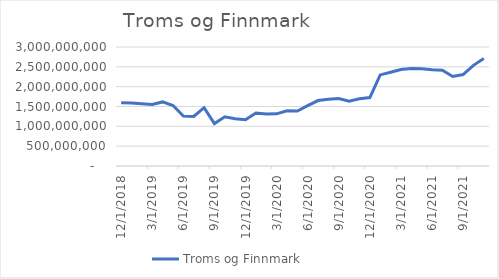
| Category | Troms og Finnmark |
|---|---|
| 12/1/18 | 1596119583.333 |
| 1/1/19 | 1590336666.667 |
| 2/1/19 | 1571578333.333 |
| 3/1/19 | 1551990833.333 |
| 4/1/19 | 1615329166.667 |
| 5/1/19 | 1523640833.333 |
| 6/1/19 | 1260486666.667 |
| 7/1/19 | 1248049166.667 |
| 8/1/19 | 1469640833.333 |
| 9/1/19 | 1069361666.667 |
| 10/1/19 | 1242163333.333 |
| 11/1/19 | 1193659166.667 |
| 12/1/19 | 1166084166.667 |
| 1/1/20 | 1336556666.667 |
| 2/1/20 | 1310373333.333 |
| 3/1/20 | 1314114166.667 |
| 4/1/20 | 1391895000 |
| 5/1/20 | 1386690833.333 |
| 6/1/20 | 1520745000 |
| 7/1/20 | 1649720416.667 |
| 8/1/20 | 1684249083.333 |
| 9/1/20 | 1701540750 |
| 10/1/20 | 1635644916.667 |
| 11/1/20 | 1696778250 |
| 12/1/20 | 1725253250 |
| 1/1/21 | 2296199083.333 |
| 2/1/21 | 2364424083.333 |
| 3/1/21 | 2431408250 |
| 4/1/21 | 2460680750 |
| 5/1/21 | 2451997416.667 |
| 6/1/21 | 2425334916.667 |
| 7/1/21 | 2411863666.667 |
| 8/1/21 | 2257914166.667 |
| 9/1/21 | 2305551666.667 |
| 10/1/21 | 2537701666.667 |
| 11/1/21 | 2712210000 |